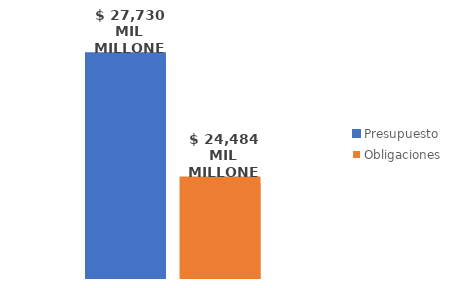
| Category | Presupuesto | Obligaciones |
|---|---|---|
| Total | 27729683444632.33 | 24484388597730.438 |